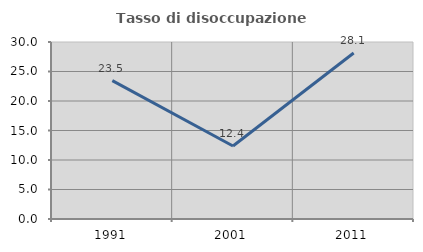
| Category | Tasso di disoccupazione giovanile  |
|---|---|
| 1991.0 | 23.46 |
| 2001.0 | 12.371 |
| 2011.0 | 28.125 |